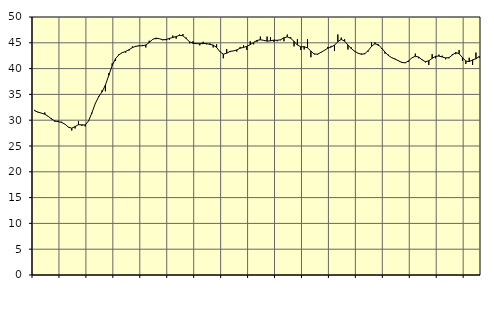
| Category | Piggar | Series 1 |
|---|---|---|
| nan | 32 | 31.82 |
| 87.0 | 31.5 | 31.57 |
| 87.0 | 31.4 | 31.37 |
| 87.0 | 31.5 | 31.16 |
| nan | 30.7 | 30.76 |
| 88.0 | 30.4 | 30.22 |
| 88.0 | 29.7 | 29.86 |
| 88.0 | 29.9 | 29.71 |
| nan | 29.7 | 29.57 |
| 89.0 | 29.2 | 29.22 |
| 89.0 | 28.7 | 28.65 |
| 89.0 | 28 | 28.45 |
| nan | 28.4 | 28.77 |
| 90.0 | 29.8 | 29.13 |
| 90.0 | 28.9 | 29.1 |
| 90.0 | 28.8 | 29.07 |
| nan | 29.9 | 29.86 |
| 91.0 | 31.3 | 31.46 |
| 91.0 | 33.3 | 33.24 |
| 91.0 | 34.7 | 34.55 |
| nan | 35.8 | 35.48 |
| 92.0 | 35.6 | 36.81 |
| 92.0 | 39.1 | 38.69 |
| 92.0 | 41 | 40.58 |
| nan | 41.5 | 41.92 |
| 93.0 | 42.8 | 42.67 |
| 93.0 | 43.2 | 43.08 |
| 93.0 | 43.1 | 43.33 |
| nan | 43.5 | 43.66 |
| 94.0 | 44.3 | 44.05 |
| 94.0 | 44.2 | 44.33 |
| 94.0 | 44.5 | 44.41 |
| nan | 44.6 | 44.42 |
| 95.0 | 44.1 | 44.58 |
| 95.0 | 45.4 | 45.06 |
| 95.0 | 45.6 | 45.65 |
| nan | 45.7 | 45.91 |
| 96.0 | 45.8 | 45.79 |
| 96.0 | 45.5 | 45.59 |
| 96.0 | 45.5 | 45.63 |
| nan | 45.6 | 45.85 |
| 97.0 | 46.4 | 46.02 |
| 97.0 | 45.8 | 46.21 |
| 97.0 | 46.6 | 46.45 |
| nan | 46.7 | 46.37 |
| 98.0 | 46 | 45.8 |
| 98.0 | 44.9 | 45.19 |
| 98.0 | 45.3 | 44.91 |
| nan | 44.9 | 44.84 |
| 99.0 | 44.5 | 44.82 |
| 99.0 | 45.2 | 44.85 |
| 99.0 | 44.7 | 44.85 |
| nan | 44.9 | 44.7 |
| 0.0 | 44.1 | 44.56 |
| 0.0 | 44.7 | 44.11 |
| 0.0 | 43.3 | 43.26 |
| nan | 42 | 42.8 |
| 1.0 | 43.8 | 42.98 |
| 1.0 | 43.2 | 43.34 |
| 1.0 | 43.4 | 43.42 |
| nan | 43.3 | 43.62 |
| 2.0 | 44.2 | 43.95 |
| 2.0 | 44.5 | 44.11 |
| 2.0 | 43.6 | 44.32 |
| nan | 45.3 | 44.65 |
| 3.0 | 44.7 | 45.08 |
| 3.0 | 45.2 | 45.46 |
| 3.0 | 46.2 | 45.59 |
| nan | 45.5 | 45.47 |
| 4.0 | 46.2 | 45.32 |
| 4.0 | 46.1 | 45.39 |
| 4.0 | 45.2 | 45.52 |
| nan | 45.3 | 45.48 |
| 5.0 | 45.5 | 45.59 |
| 5.0 | 45.3 | 45.98 |
| 5.0 | 46.6 | 46.14 |
| nan | 46.1 | 45.87 |
| 6.0 | 44.3 | 45.28 |
| 6.0 | 45.7 | 44.56 |
| 6.0 | 43.6 | 44.23 |
| nan | 43.7 | 44.24 |
| 7.0 | 45.7 | 44.02 |
| 7.0 | 42.2 | 43.39 |
| 7.0 | 42.9 | 42.8 |
| nan | 42.7 | 42.81 |
| 8.0 | 43.1 | 43.16 |
| 8.0 | 43.5 | 43.53 |
| 8.0 | 44.2 | 43.94 |
| nan | 44.4 | 44.18 |
| 9.0 | 43.4 | 44.53 |
| 9.0 | 46.6 | 45.22 |
| 9.0 | 46 | 45.65 |
| nan | 45.7 | 45.33 |
| 10.0 | 43.7 | 44.57 |
| 10.0 | 44.1 | 43.86 |
| 10.0 | 43.3 | 43.36 |
| nan | 43 | 42.98 |
| 11.0 | 42.9 | 42.77 |
| 11.0 | 42.8 | 42.9 |
| 11.0 | 43.3 | 43.47 |
| nan | 45.1 | 44.31 |
| 12.0 | 45.1 | 44.81 |
| 12.0 | 44.4 | 44.62 |
| 12.0 | 43.8 | 43.97 |
| nan | 42.9 | 43.21 |
| 13.0 | 42.7 | 42.54 |
| 13.0 | 42.2 | 42.12 |
| 13.0 | 41.9 | 41.84 |
| nan | 41.6 | 41.52 |
| 14.0 | 41.3 | 41.19 |
| 14.0 | 41.2 | 41.11 |
| 14.0 | 41.3 | 41.5 |
| nan | 42.1 | 42.09 |
| 15.0 | 42.9 | 42.39 |
| 15.0 | 42 | 42.24 |
| 15.0 | 41.8 | 41.7 |
| nan | 41.2 | 41.33 |
| 16.0 | 40.7 | 41.52 |
| 16.0 | 42.8 | 41.98 |
| 16.0 | 42 | 42.37 |
| nan | 42.7 | 42.43 |
| 17.0 | 42.5 | 42.25 |
| 17.0 | 41.8 | 42.07 |
| 17.0 | 42 | 42.12 |
| nan | 42.8 | 42.63 |
| 18.0 | 42.8 | 43.11 |
| 18.0 | 43.6 | 42.88 |
| 18.0 | 41.5 | 42.12 |
| nan | 40.9 | 41.46 |
| 19.0 | 42.1 | 41.35 |
| 19.0 | 40.7 | 41.69 |
| 19.0 | 43.1 | 41.9 |
| nan | 42.1 | 42.36 |